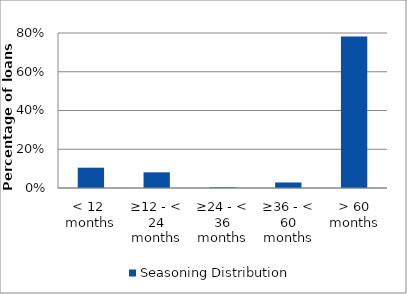
| Category | Seasoning Distribution  |
|---|---|
| < 12  months | 0.105 |
| ≥12 - < 24 months | 0.081 |
| ≥24 - < 36 months | 0.003 |
| ≥36 - < 60 months | 0.029 |
| > 60 months | 0.782 |